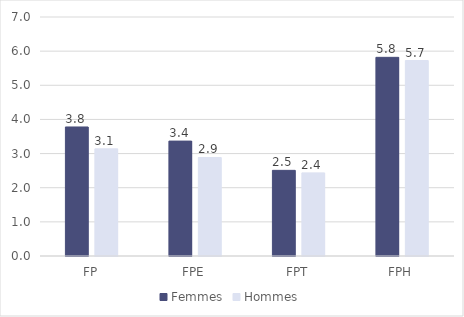
| Category | Femmes | Hommes |
|---|---|---|
| FP | 3.779 | 3.138 |
| FPE | 3.365 | 2.885 |
| FPT | 2.509 | 2.434 |
| FPH | 5.818 | 5.725 |